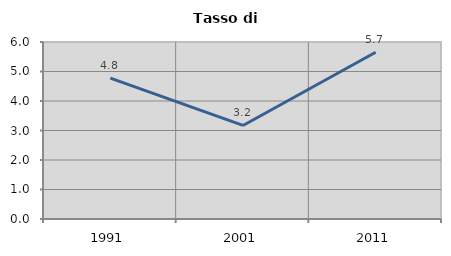
| Category | Tasso di disoccupazione   |
|---|---|
| 1991.0 | 4.776 |
| 2001.0 | 3.171 |
| 2011.0 | 5.652 |